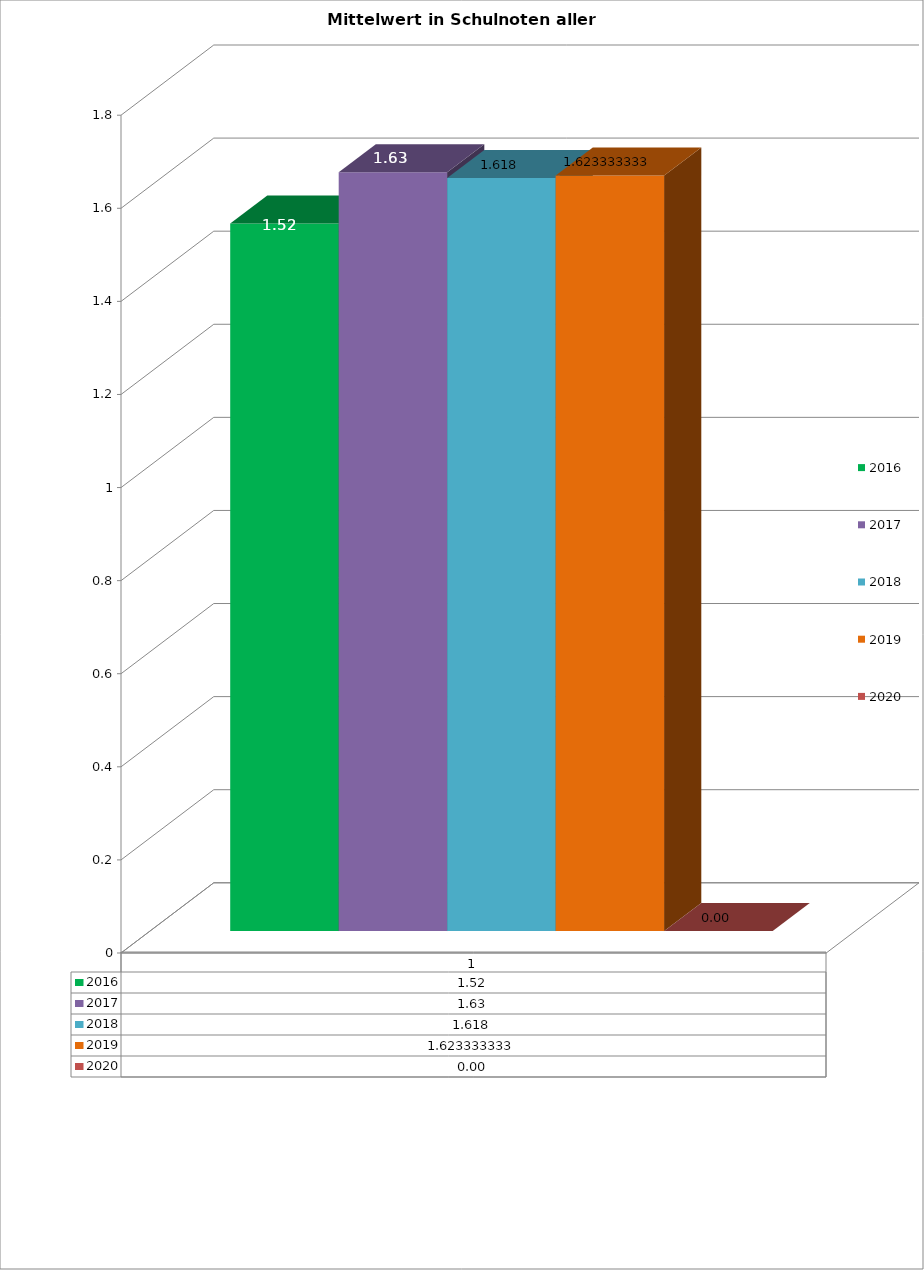
| Category | 2016 | 2017 | 2018 | 2019 | 2020 |
|---|---|---|---|---|---|
| 0 | 1.52 | 1.63 | 1.618 | 1.623 | 0 |